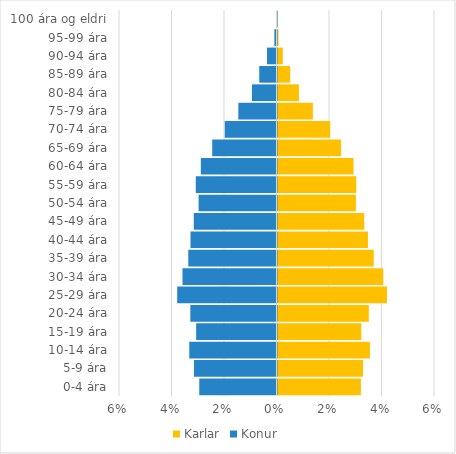
| Category | Karlar | Konur |
|---|---|---|
| 0-4 ára | 0.032 | -0.029 |
| 5-9 ára | 0.033 | -0.031 |
| 10-14 ára | 0.035 | -0.033 |
| 15-19 ára | 0.032 | -0.031 |
| 20-24 ára | 0.035 | -0.033 |
| 25-29 ára | 0.042 | -0.038 |
| 30-34 ára | 0.04 | -0.036 |
| 35-39 ára | 0.037 | -0.034 |
| 40-44 ára | 0.034 | -0.033 |
| 45-49 ára | 0.033 | -0.032 |
| 50-54 ára | 0.03 | -0.03 |
| 55-59 ára | 0.03 | -0.031 |
| 60-64 ára | 0.029 | -0.029 |
| 65-69 ára | 0.024 | -0.024 |
| 70-74 ára | 0.02 | -0.02 |
| 75-79 ára | 0.013 | -0.015 |
| 80-84 ára | 0.008 | -0.009 |
| 85-89 ára | 0.005 | -0.007 |
| 90-94 ára | 0.002 | -0.004 |
| 95-99 ára | 0 | -0.001 |
| 100 ára og eldri | 0 | 0 |